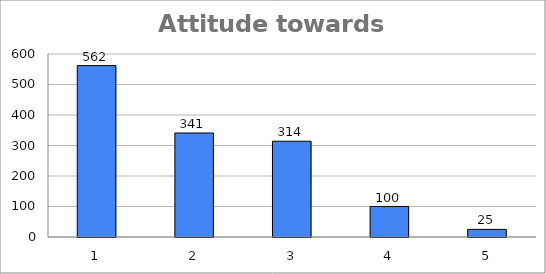
| Category | Series 0 |
|---|---|
| 0 | 562 |
| 1 | 341 |
| 2 | 314 |
| 3 | 100 |
| 4 | 25 |